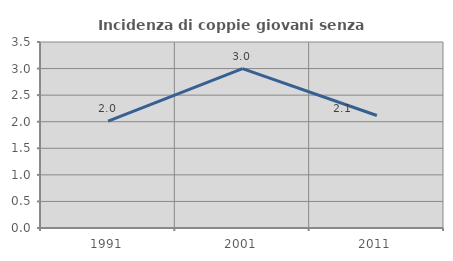
| Category | Incidenza di coppie giovani senza figli |
|---|---|
| 1991.0 | 2.01 |
| 2001.0 | 3 |
| 2011.0 | 2.116 |